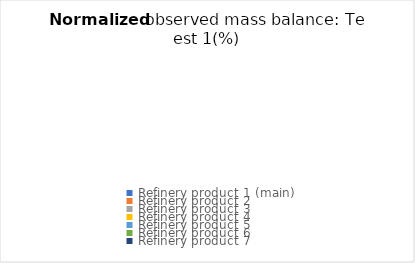
| Category | Series 0 | Normalized observed mass balance Result |
|---|---|---|
| Refinery product 1 (main) | 0 |  |
| Refinery product 2 | 0 |  |
| Refinery product 3 | 0 |  |
| Refinery product 4 | 0 |  |
| Refinery product 5 | 0 |  |
| Refinery product 6 | 0 |  |
| Refinery product 7 | 0 |  |